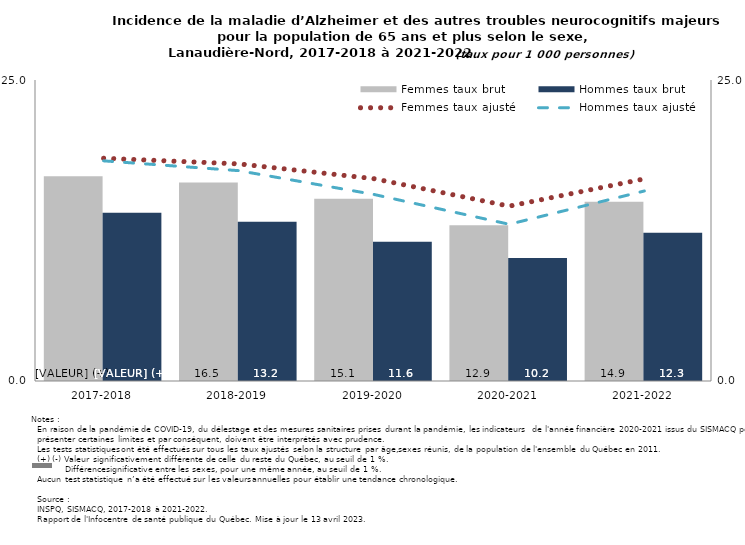
| Category | Femmes taux brut | Hommes taux brut |
|---|---|---|
| 2017-2018 | 17.014 | 13.978 |
| 2018-2019 | 16.497 | 13.23 |
| 2019-2020 | 15.145 | 11.572 |
| 2020-2021 | 12.929 | 10.219 |
| 2021-2022 | 14.879 | 12.319 |